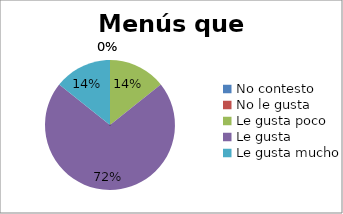
| Category | Series 0 |
|---|---|
| No contesto | 0 |
| No le gusta | 0 |
| Le gusta poco | 1 |
| Le gusta | 5 |
| Le gusta mucho | 1 |